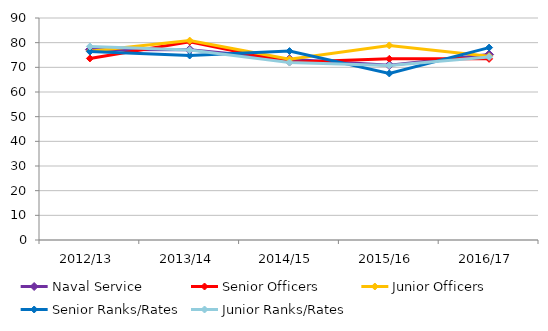
| Category | Naval Service | Senior Officers | Junior Officers | Senior Ranks/Rates | Junior Ranks/Rates |
|---|---|---|---|---|---|
| 2012/13 | 77.196 | 73.608 | 76.567 | 76.407 | 78.469 |
| 2013/14 | 77.124 | 80.403 | 80.834 | 74.794 | 77.013 |
| 2014/15 | 73.289 | 72.036 | 73.283 | 76.6 | 71.928 |
| 2015/16 | 70.896 | 73.438 | 78.889 | 67.53 | 70.759 |
| 2016/17 | 75.173 | 73.43 | 74.524 | 78.007 | 74.214 |